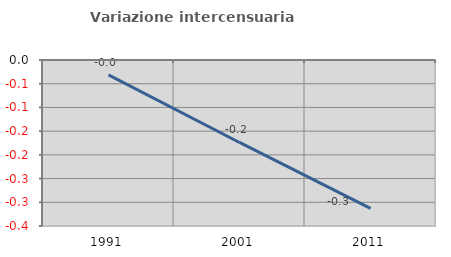
| Category | Variazione intercensuaria annua |
|---|---|
| 1991.0 | -0.031 |
| 2001.0 | -0.174 |
| 2011.0 | -0.313 |